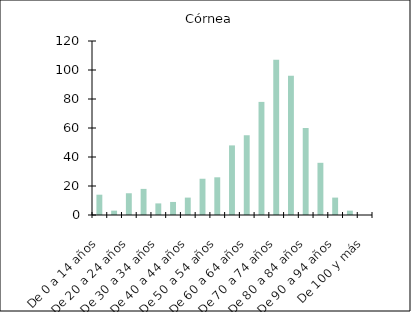
| Category | Córnea |
|---|---|
| De 0 a 14 años | 14 |
| De 15 a 19 años | 3 |
| De 20 a 24 años | 15 |
| De 25 a 29 años | 18 |
| De 30 a 34 años | 8 |
| De 35 a 39 años | 9 |
| De 40 a 44 años | 12 |
| De 45 a 49 años | 25 |
| De 50 a 54 años | 26 |
| De 55 a 59 años | 48 |
| De 60 a 64 años | 55 |
| De 65 a 69 años | 78 |
| De 70 a 74 años | 107 |
| De 75 a 79 años | 96 |
| De 80 a 84 años | 60 |
| De 85 a 89 años | 36 |
| De 90 a 94 años | 12 |
| De 95 a 99 años | 3 |
| De 100 y más | 0 |